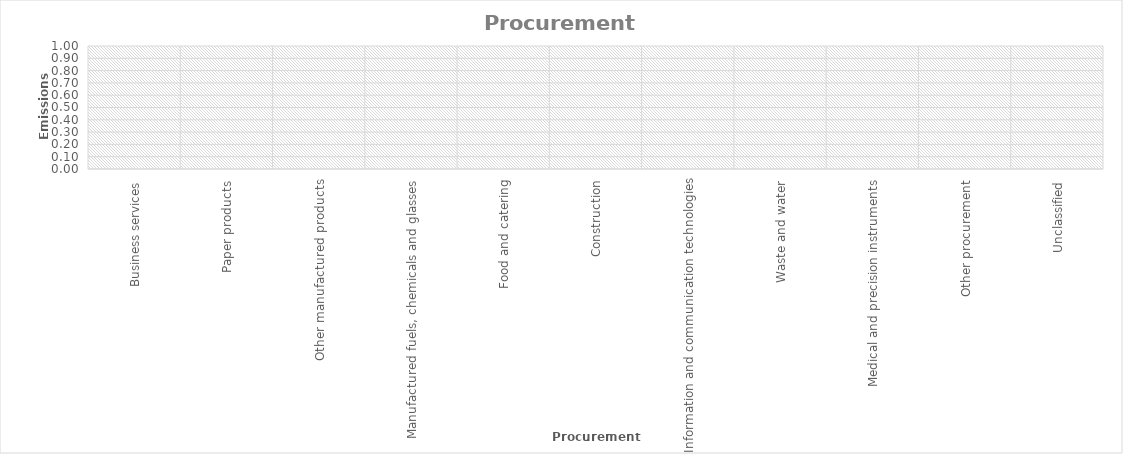
| Category | Series 0 | Series 1 |
|---|---|---|
| Business services | 0 |  |
| Paper products | 0 |  |
| Other manufactured products | 0 |  |
| Manufactured fuels, chemicals and glasses | 0 |  |
| Food and catering | 0 |  |
| Construction | 0 |  |
| Information and communication technologies | 0 |  |
| Waste and water | 0 |  |
| Medical and precision instruments | 0 |  |
| Other procurement | 0 |  |
| Unclassified | 0 |  |